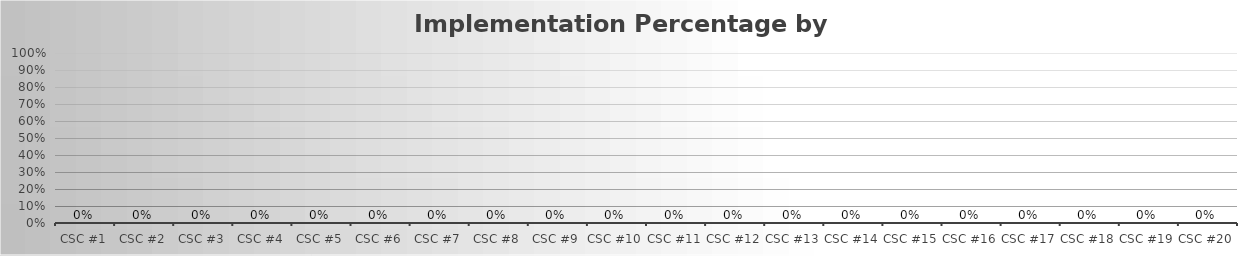
| Category | Series 0 |
|---|---|
| CSC #1 | 0 |
| CSC #2 | 0 |
| CSC #3 | 0 |
| CSC #4 | 0 |
| CSC #5 | 0 |
| CSC #6 | 0 |
| CSC #7 | 0 |
| CSC #8 | 0 |
| CSC #9 | 0 |
| CSC #10 | 0 |
| CSC #11 | 0 |
| CSC #12 | 0 |
| CSC #13 | 0 |
| CSC #14 | 0 |
| CSC #15 | 0 |
| CSC #16 | 0 |
| CSC #17 | 0 |
| CSC #18 | 0 |
| CSC #19 | 0 |
| CSC #20 | 0 |